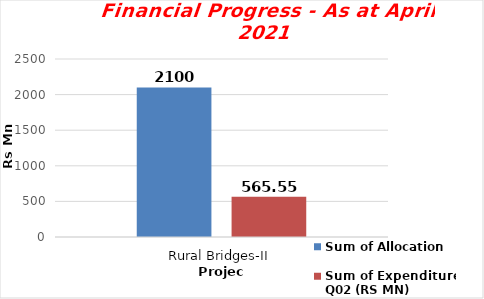
| Category | Sum of Allocation  | Sum of Expenditure Q02 (RS MN) |
|---|---|---|
| Rural Bridges-II | 2100 | 565.55 |